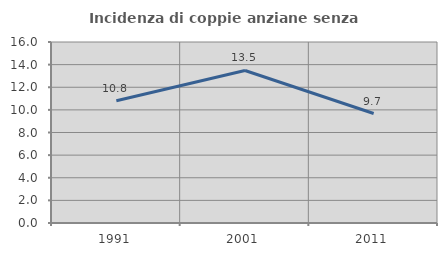
| Category | Incidenza di coppie anziane senza figli  |
|---|---|
| 1991.0 | 10.811 |
| 2001.0 | 13.483 |
| 2011.0 | 9.677 |